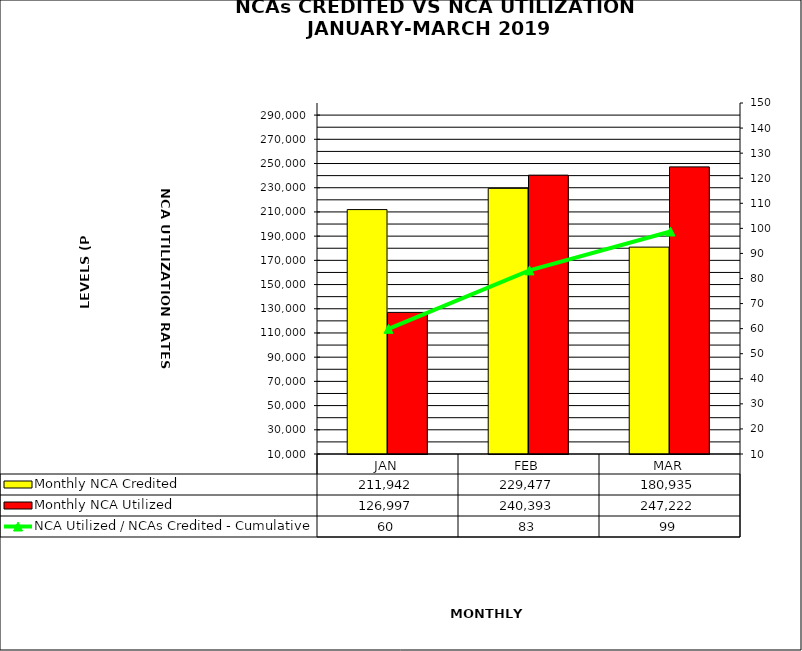
| Category | Monthly NCA Credited | Monthly NCA Utilized |
|---|---|---|
| JAN | 211942.048 | 126996.966 |
| FEB | 229477.028 | 240393.27 |
| MAR | 180934.664 | 247222.25 |